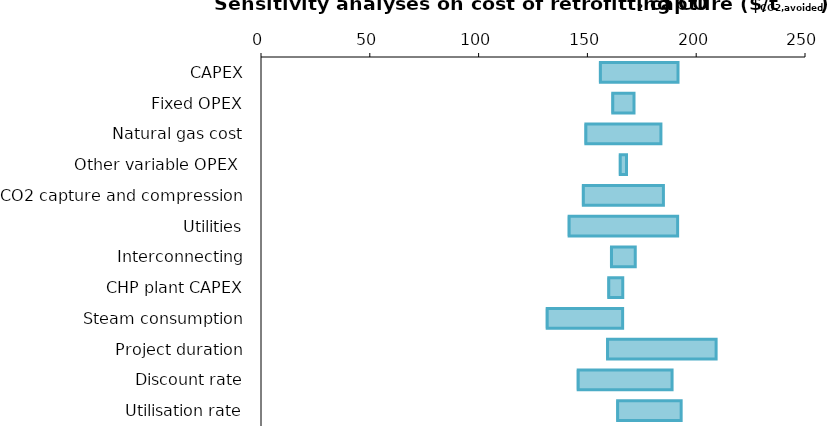
| Category | Minimum value | Increase of the parameter |
|---|---|---|
| CAPEX | 155.283 | 36.357 |
| Fixed OPEX | 160.98 | 10.42 |
| Natural gas cost | 148.599 | 35.181 |
| Other variable OPEX  | 164.432 | 3.517 |
| CO2 capture and compression | 147.448 | 37.484 |
| Utilities | 140.915 | 50.55 |
| Interconnecting | 160.35 | 11.68 |
| CHP plant CAPEX | 159.125 | 7.064 |
| Steam consumption | 130.835 | 35.354 |
| Project duration | 158.569 | 50.584 |
| Discount rate | 145.074 | 43.834 |
| Utilisation rate | 163.202 | 29.882 |